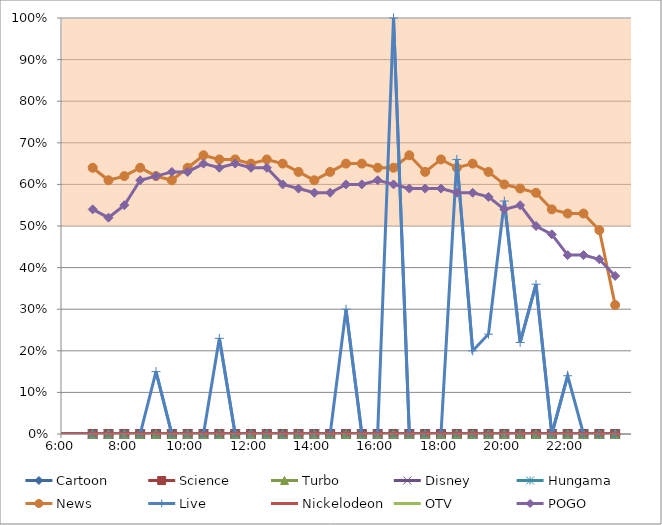
| Category | Series 10 | color2 |
|---|---|---|
| 0.25 | 0.5 | 0.5 |
| 0.3125 | 0.5 | 0.5 |
| 0.3333333333333333 | 0.5 | 0.5 |
| 0.3541666666666667 | 0.5 | 0.5 |
| 0.375 | 0.5 | 0.5 |
| 0.3958333333333333 | 0.5 | 0.5 |
| 0.4166666666666667 | 0.5 | 0.5 |
| 0.4375 | 0.5 | 0.5 |
| 0.4583333333333333 | 0.5 | 0.5 |
| 0.4791666666666667 | 0.5 | 0.5 |
| 0.5 | 0.5 | 0.5 |
| 0.5208333333333334 | 0.5 | 0.5 |
| 0.5416666666666666 | 0.5 | 0.5 |
| 0.5625 | 0.5 | 0.5 |
| 0.5833333333333334 | 0.5 | 0.5 |
| 0.6041666666666666 | 0.5 | 0.5 |
| 0.625 | 0.5 | 0.5 |
| 0.6458333333333334 | 0.5 | 0.5 |
| 0.6666666666666666 | 0.5 | 0.5 |
| 0.6875 | 0.5 | 0.5 |
| 0.7083333333333334 | 0.5 | 0.5 |
| 0.7291666666666666 | 0.5 | 0.5 |
| 0.75 | 0.5 | 0.5 |
| 0.7708333333333334 | 0.5 | 0.5 |
| 0.7916666666666666 | 0.5 | 0.5 |
| 0.8125 | 0.5 | 0.5 |
| 0.8333333333333334 | 0.5 | 0.5 |
| 0.8541666666666666 | 0.5 | 0.5 |
| 0.875 | 0.5 | 0.5 |
| 0.8958333333333334 | 0.5 | 0.5 |
| 0.9166666666666666 | 0.5 | 0.5 |
| 0.9375 | 0.5 | 0.5 |
| 0.9583333333333334 | 0.5 | 0.5 |
| 0.9999884259259259 | 0.5 | 0.5 |